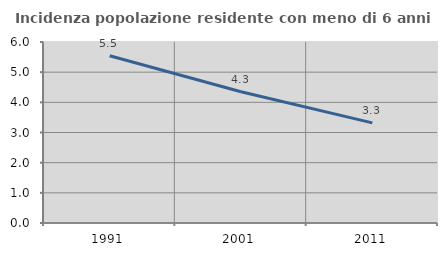
| Category | Incidenza popolazione residente con meno di 6 anni |
|---|---|
| 1991.0 | 5.542 |
| 2001.0 | 4.35 |
| 2011.0 | 3.319 |